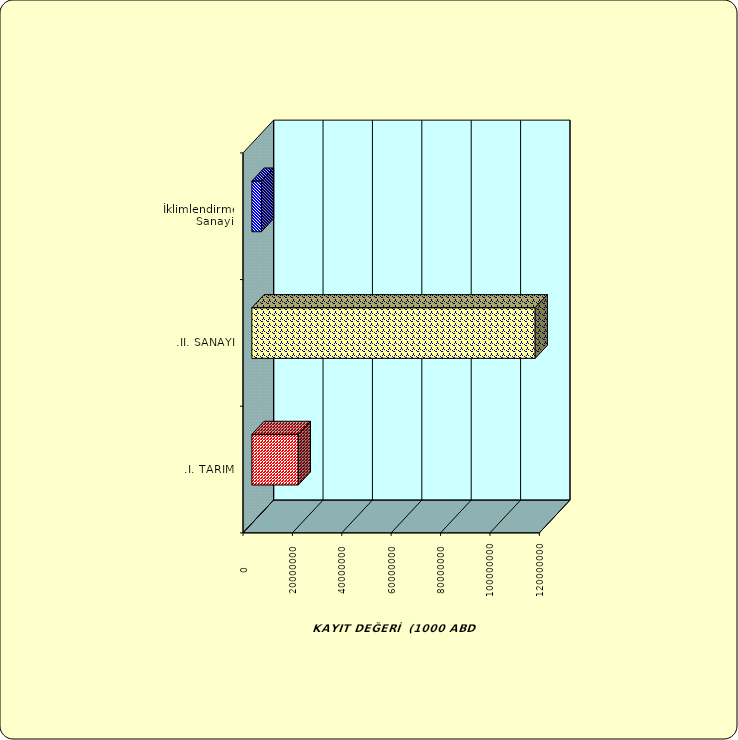
| Category | Series 0 |
|---|---|
| .I. TARIM | 18777899.897 |
| .II. SANAYİ | 114710447.974 |
|  İklimlendirme Sanayii | 3869572.65 |